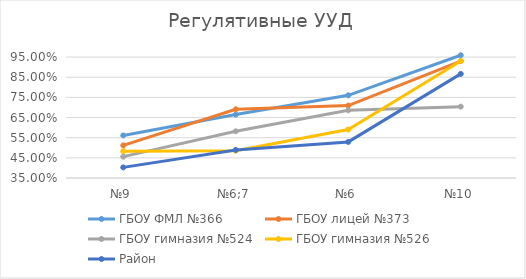
| Category | ГБОУ ФМЛ №366 | ГБОУ лицей №373 | ГБОУ гимназия №524 | ГБОУ гимназия №526 | Район |
|---|---|---|---|---|---|
| №9 | 0.561 | 0.512 | 0.456 | 0.483 | 0.403 |
| №6;7 | 0.665 | 0.691 | 0.582 | 0.485 | 0.489 |
| №6 | 0.76 | 0.709 | 0.686 | 0.59 | 0.529 |
| №10 | 0.959 | 0.93 | 0.704 | 0.931 | 0.866 |